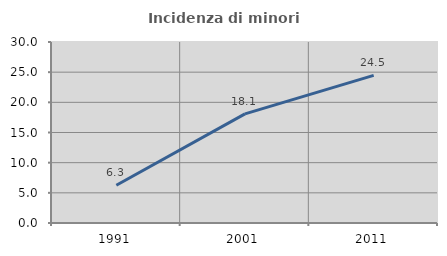
| Category | Incidenza di minori stranieri |
|---|---|
| 1991.0 | 6.25 |
| 2001.0 | 18.095 |
| 2011.0 | 24.462 |